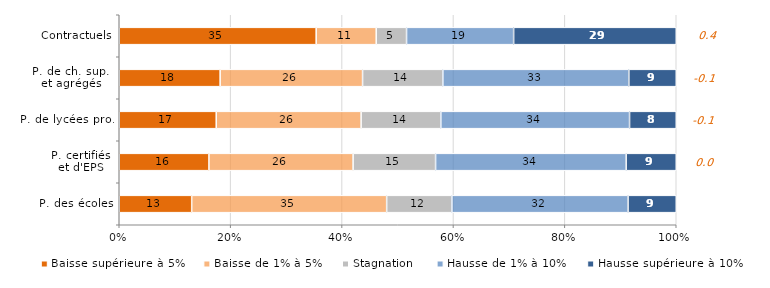
| Category | Baisse supérieure à 5% | Baisse de 1% à 5% | Stagnation | Hausse de 1% à 10% | Hausse supérieure à 10% |
|---|---|---|---|---|---|
| P. des écoles | 13.006 | 35.003 | 11.708 | 31.633 | 8.651 |
| P. certifiés
et d'EPS | 16.1 | 25.884 | 14.807 | 34.216 | 8.993 |
| P. de lycées pro. | 17.41 | 26.013 | 14.31 | 33.882 | 8.384 |
| P. de ch. sup. 
et agrégés | 18.114 | 25.57 | 14.413 | 33.395 | 8.507 |
| Contractuels | 35.357 | 10.777 | 5.448 | 19.225 | 29.193 |